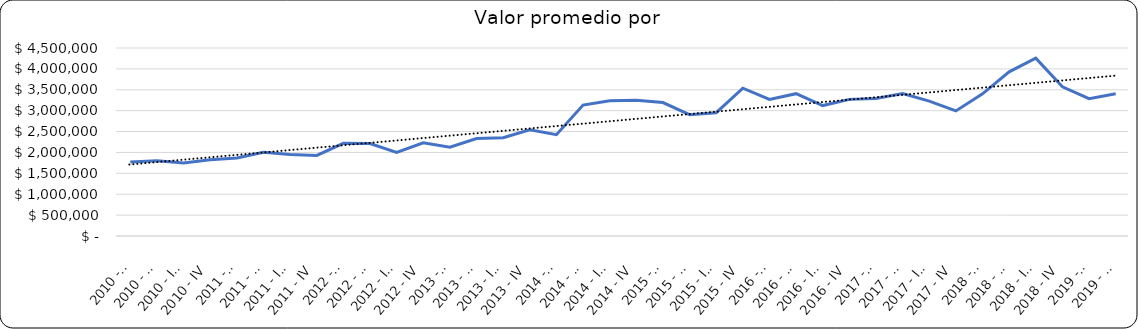
| Category | Valor m2 en Bogotá por sectores |
|---|---|
| 2010 - I | 1768398.268 |
| 2010 - II | 1803030.303 |
| 2010 - III | 1746753.247 |
| 2010 - IV | 1824675.325 |
| 2011 - I | 1868201.754 |
| 2011 - II | 2004385.965 |
| 2011 - III | 1949561.404 |
| 2011 - IV | 1927631.579 |
| 2012 - I | 2218750 |
| 2012 - II | 2214166.667 |
| 2012 - III | 2000000 |
| 2012 - IV | 2229166.667 |
| 2013 - I | 2127083.333 |
| 2013 - II | 2331250 |
| 2013 - III | 2354166.667 |
| 2013 - IV | 2541666.667 |
| 2014 - I | 2424951.267 |
| 2014 - II | 3134502.924 |
| 2014 - III | 3237816.764 |
| 2014 - IV | 3247563.353 |
| 2015 - I | 3193205.945 |
| 2015 - II | 2904458.599 |
| 2015 - III | 2951167.728 |
| 2015 - IV | 3538685.775 |
| 2016 - I | 3267489.712 |
| 2016 - II | 3406250 |
| 2016 - III | 3121875 |
| 2016 - IV | 3270299.145 |
| 2017 - I | 3293248.945 |
| 2017 - II | 3410041.841 |
| 2017 - III | 3227091.633 |
| 2017 - IV | 2994011.976 |
| 2018 - I | 3402777.778 |
| 2018 - II | 3928571.429 |
| 2018 - III | 4256757 |
| 2018 - IV | 3571429 |
| 2019 - I | 3288591 |
| 2019 - II | 3404885 |